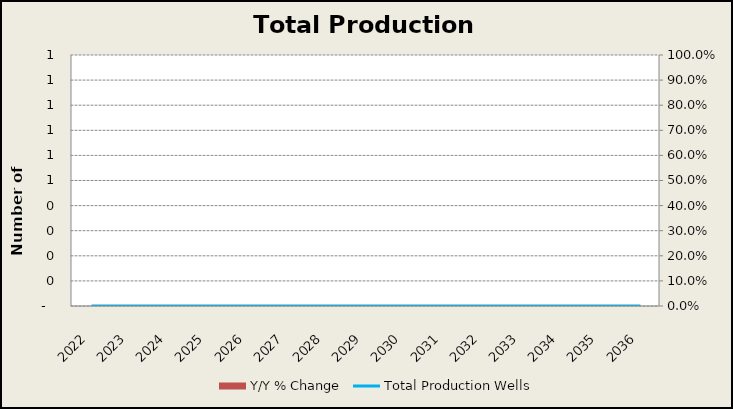
| Category | Y/Y % Change |
|---|---|
| 2022.0 | 0 |
| 2023.0 | 0 |
| 2024.0 | 0 |
| 2025.0 | 0 |
| 2026.0 | 0 |
| 2027.0 | 0 |
| 2028.0 | 0 |
| 2029.0 | 0 |
| 2030.0 | 0 |
| 2031.0 | 0 |
| 2032.0 | 0 |
| 2033.0 | 0 |
| 2034.0 | 0 |
| 2035.0 | 0 |
| 2036.0 | 0 |